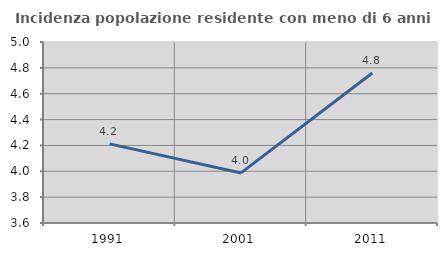
| Category | Incidenza popolazione residente con meno di 6 anni |
|---|---|
| 1991.0 | 4.212 |
| 2001.0 | 3.987 |
| 2011.0 | 4.76 |